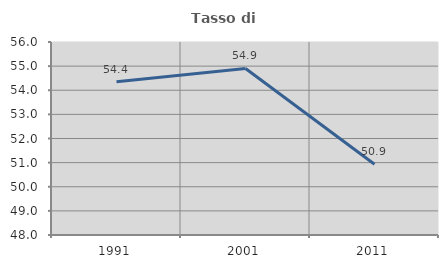
| Category | Tasso di occupazione   |
|---|---|
| 1991.0 | 54.354 |
| 2001.0 | 54.905 |
| 2011.0 | 50.935 |